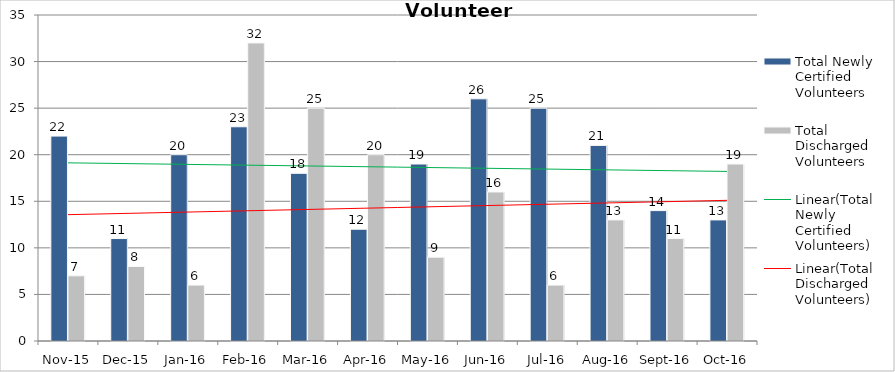
| Category | Total Newly Certified Volunteers | Total Discharged Volunteers |
|---|---|---|
| Nov-15 | 22 | 7 |
| Dec-15 | 11 | 8 |
| Jan-16 | 20 | 6 |
| Feb-16 | 23 | 32 |
| Mar-16 | 18 | 25 |
| Apr-16 | 12 | 20 |
| May-16 | 19 | 9 |
| Jun-16 | 26 | 16 |
| Jul-16 | 25 | 6 |
| Aug-16 | 21 | 13 |
| Sep-16 | 14 | 11 |
| Oct-16 | 13 | 19 |